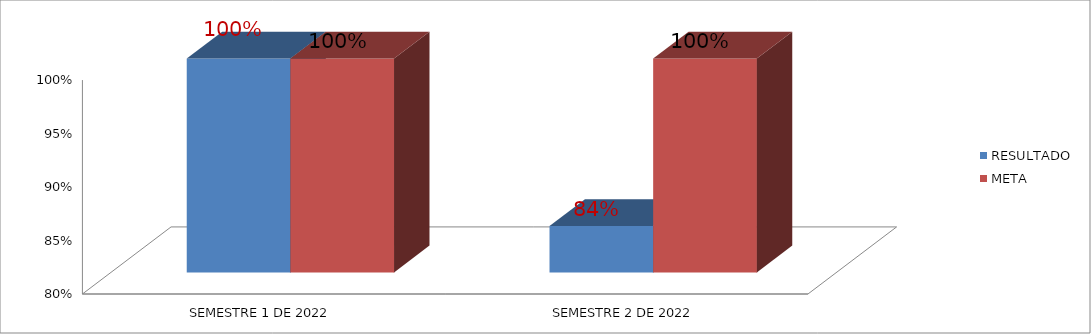
| Category | RESULTADO | META |
|---|---|---|
| SEMESTRE 1 DE 2022 | 1 | 1 |
| SEMESTRE 2 DE 2022 | 0.843 | 1 |